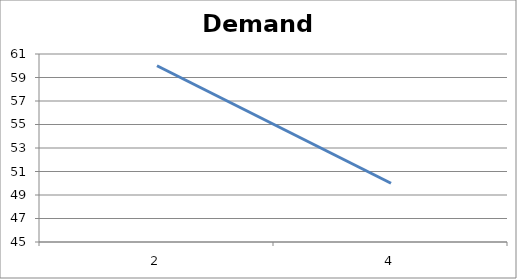
| Category | P |
|---|---|
| 2.0 | 60 |
| 4.0 | 50 |